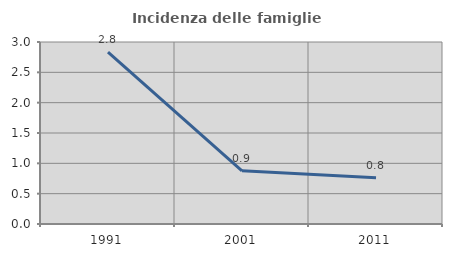
| Category | Incidenza delle famiglie numerose |
|---|---|
| 1991.0 | 2.834 |
| 2001.0 | 0.876 |
| 2011.0 | 0.763 |